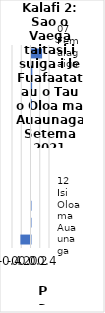
| Category |     Contributions |
|---|---|
| 07 Femalagaiga | 0.229 |
| 02 Ava Malosi ma Tapaa | 0.017 |
| 04 Fale, Suavai, Eletise, Kesi ma isi | 0.013 |
| 05 Meafale, Mea Faigaluega/Faaleleia o Aiga | 0.008 |
| 06 Soifua Maloloina | 0 |
| 11 Faleaiga | 0 |
| 08 Fesootaiga | 0 |
| 10 Aoaoga | 0 |
| 09 Faafiafiaga ma Aganuu | 0 |
| 03 Lavalava ma Seevae | -0.004 |
| 12 Isi Oloa ma Auaunaga | -0.007 |
| 01 Meaai ma Vaiinu | -0.219 |